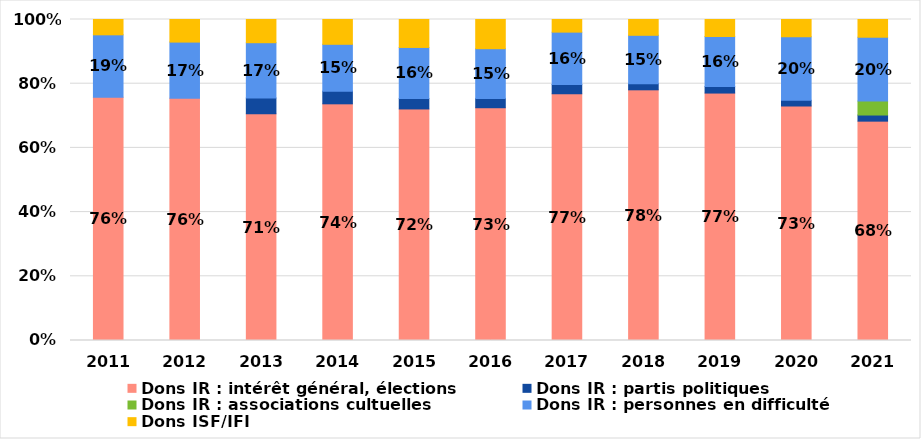
| Category | Dons IR : intérêt général, élections | Dons IR : partis politiques | Dons IR : associations cultuelles | Dons IR : personnes en difficulté | Dons ISF/IFI |
|---|---|---|---|---|---|
| 2011.0 | 0.758 | 0 | 0 | 0.194 | 0.048 |
| 2012.0 | 0.755 | 0 | 0 | 0.175 | 0.07 |
| 2013.0 | 0.706 | 0.049 | 0 | 0.172 | 0.072 |
| 2014.0 | 0.737 | 0.039 | 0 | 0.146 | 0.077 |
| 2015.0 | 0.721 | 0.032 | 0 | 0.159 | 0.087 |
| 2016.0 | 0.725 | 0.029 | 0 | 0.155 | 0.091 |
| 2017.0 | 0.769 | 0.029 | 0 | 0.163 | 0.039 |
| 2018.0 | 0.781 | 0.019 | 0 | 0.151 | 0.049 |
| 2019.0 | 0.771 | 0.02 | 0 | 0.156 | 0.053 |
| 2020.0 | 0.731 | 0.018 | 0 | 0.198 | 0.054 |
| 2021.0 | 0.683 | 0.019 | 0.043 | 0.199 | 0.055 |